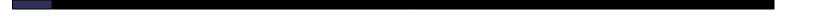
| Category | Series 0 | Series 1 |
|---|---|---|
| 0 | 5.254 | 94.746 |